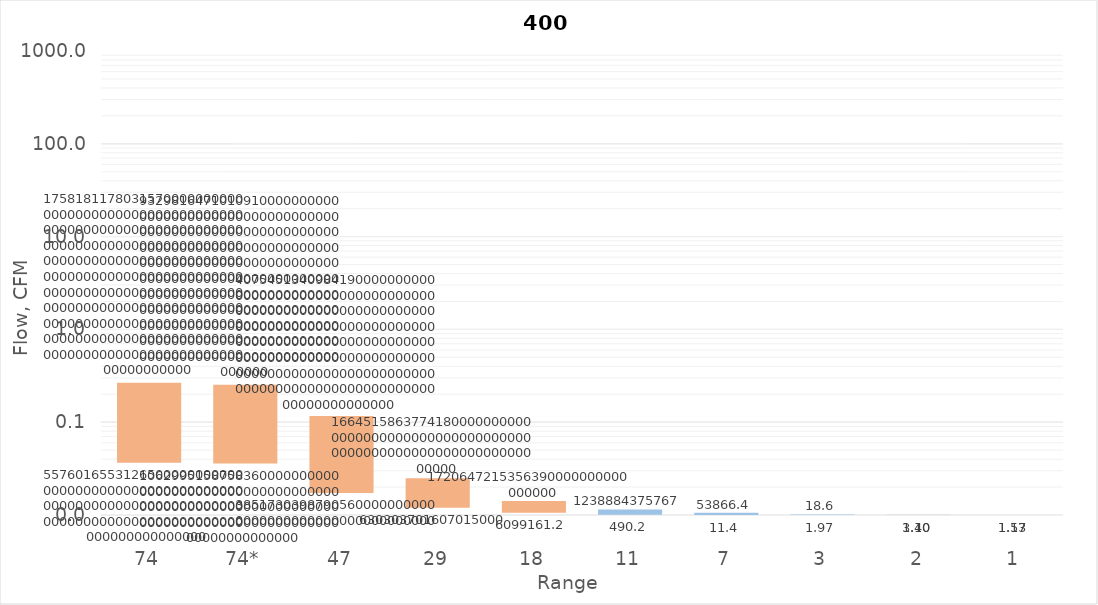
| Category | min Flow, CFM | delta | max Flow, CFM |
|---|---|---|---|
| 74 | 114.746 | 170.499 | 285.245 |
| 74* | 113.027 | 167.943 | 280.97 |
| 47 | 49.586 | 164.025 | 213.61 |
| 29 | 17.8 | 61.422 | 79.221 |
| 18 | 6.785 | 23.45 | 30.236 |
| 11 | 2.69 | 9.403 | 12.093 |
| 7 | 1.057 | 3.675 | 4.731 |
| 3 | 0.294 | 0.975 | 1.269 |
| 2 | 0.145 | 0.346 | 0.491 |
| 1 | 0.054 | 0.143 | 0.197 |